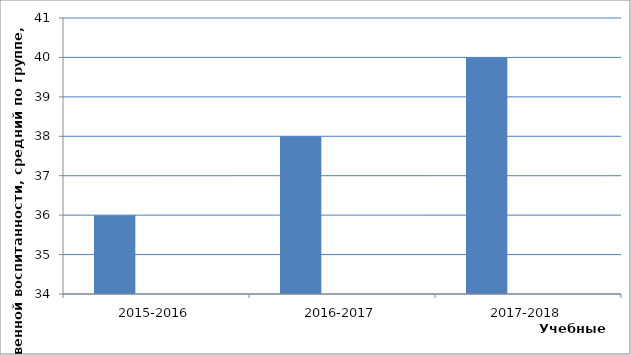
| Category | Series 0 | Series 1 | Series 2 |
|---|---|---|---|
| 2015-2016 | 36 |  |  |
| 2016-2017 | 38 |  |  |
| 2017-2018 | 40 |  |  |